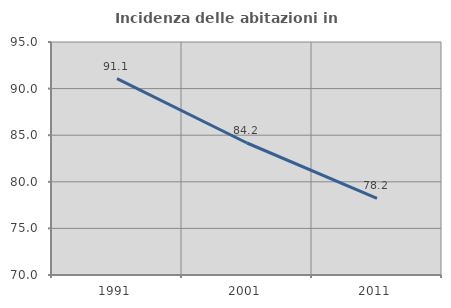
| Category | Incidenza delle abitazioni in proprietà  |
|---|---|
| 1991.0 | 91.071 |
| 2001.0 | 84.163 |
| 2011.0 | 78.222 |